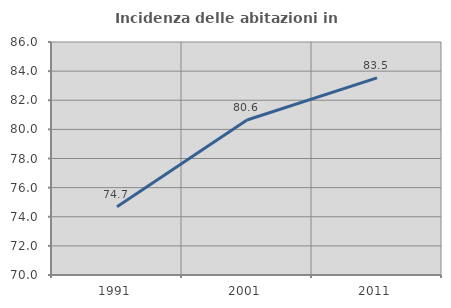
| Category | Incidenza delle abitazioni in proprietà  |
|---|---|
| 1991.0 | 74.687 |
| 2001.0 | 80.643 |
| 2011.0 | 83.539 |